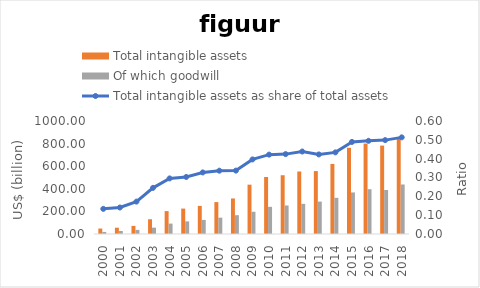
| Category | Total intangible assets | Of which goodwill |
|---|---|---|
| 2000.0 | 48.141 | 18.466 |
| 2001.0 | 55.877 | 26.477 |
| 2002.0 | 71.92 | 36.347 |
| 2003.0 | 130.655 | 56.242 |
| 2004.0 | 202.749 | 92.096 |
| 2005.0 | 224.883 | 111.492 |
| 2006.0 | 248.858 | 124.638 |
| 2007.0 | 282.492 | 144.496 |
| 2008.0 | 314.406 | 166.487 |
| 2009.0 | 436.567 | 196.738 |
| 2010.0 | 504.483 | 240.421 |
| 2011.0 | 520.015 | 252.614 |
| 2012.0 | 553.222 | 266.975 |
| 2013.0 | 556.961 | 286.682 |
| 2014.0 | 620.273 | 320.168 |
| 2015.0 | 763.024 | 367.767 |
| 2016.0 | 800.399 | 396.365 |
| 2017.0 | 782.268 | 389.537 |
| 2018.0 | 857.484 | 438.216 |